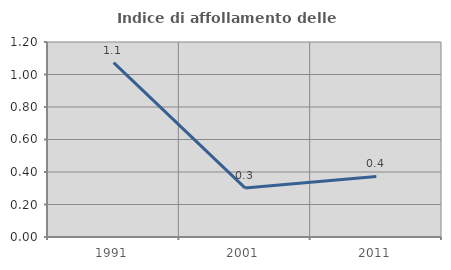
| Category | Indice di affollamento delle abitazioni  |
|---|---|
| 1991.0 | 1.073 |
| 2001.0 | 0.302 |
| 2011.0 | 0.373 |